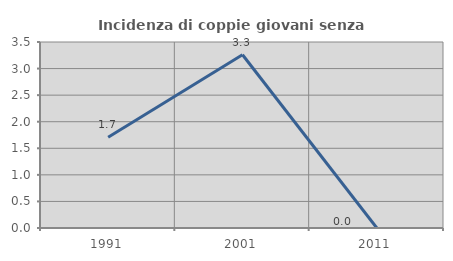
| Category | Incidenza di coppie giovani senza figli |
|---|---|
| 1991.0 | 1.709 |
| 2001.0 | 3.261 |
| 2011.0 | 0 |